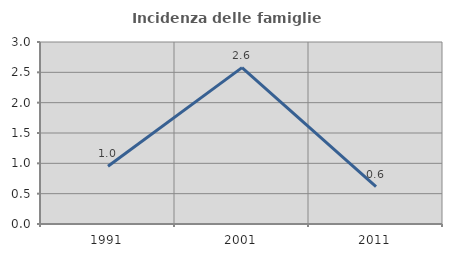
| Category | Incidenza delle famiglie numerose |
|---|---|
| 1991.0 | 0.952 |
| 2001.0 | 2.577 |
| 2011.0 | 0.617 |